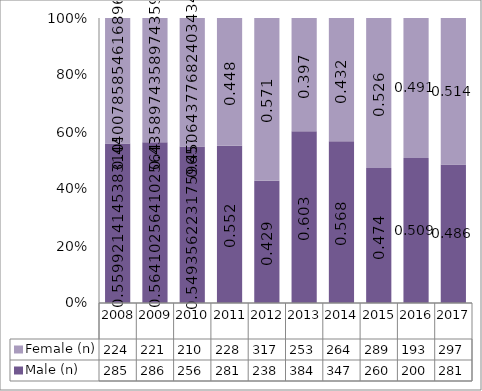
| Category | Male (n) | Female (n) |
|---|---|---|
| 2008.0 | 285 | 224 |
| 2009.0 | 286 | 221 |
| 2010.0 | 256 | 210 |
| 2011.0 | 281 | 228 |
| 2012.0 | 238 | 317 |
| 2013.0 | 384 | 253 |
| 2014.0 | 347 | 264 |
| 2015.0 | 260 | 289 |
| 2016.0 | 200 | 193 |
| 2017.0 | 281 | 297 |